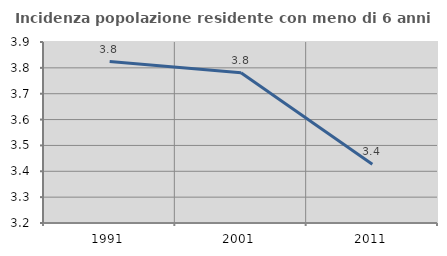
| Category | Incidenza popolazione residente con meno di 6 anni |
|---|---|
| 1991.0 | 3.825 |
| 2001.0 | 3.781 |
| 2011.0 | 3.427 |